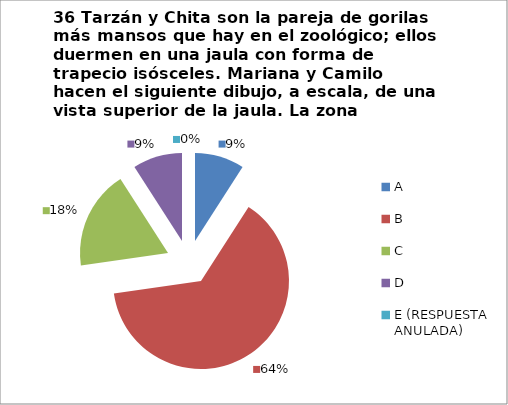
| Category | CANTIDAD DE RESPUESTAS PREGUNTA (36) | PORCENTAJE |
|---|---|---|
| A | 2 | 0.091 |
| B | 14 | 0.636 |
| C | 4 | 0.182 |
| D | 2 | 0.091 |
| E (RESPUESTA ANULADA) | 0 | 0 |